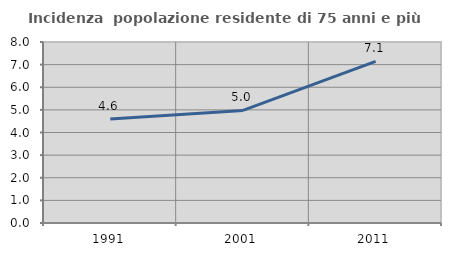
| Category | Incidenza  popolazione residente di 75 anni e più |
|---|---|
| 1991.0 | 4.592 |
| 2001.0 | 4.975 |
| 2011.0 | 7.143 |